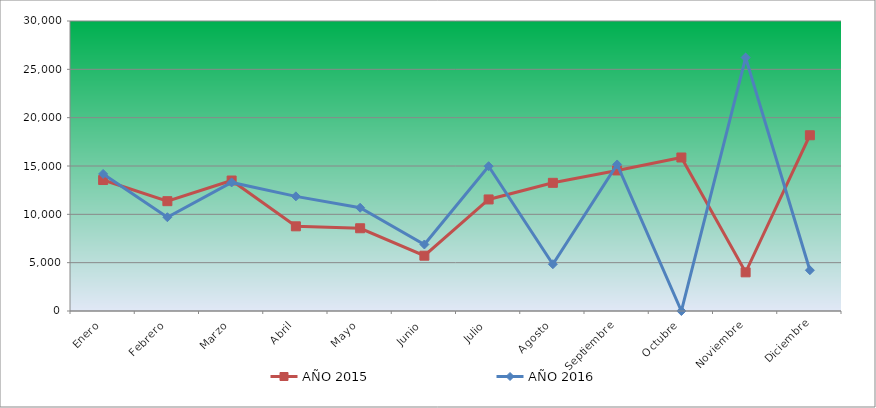
| Category | AÑO 2015 | AÑO 2016 |
|---|---|---|
| Enero | 13550 | 14180 |
| Febrero | 11360 | 9700 |
| Marzo | 13500 | 13300 |
| Abril | 8760 | 11860 |
| Mayo | 8560 | 10680 |
| Junio | 5720 | 6880 |
| Julio | 11540 | 14980 |
| Agosto | 13260 | 4840 |
| Septiembre | 14540 | 15160 |
| Octubre | 15880 | 0 |
| Noviembre | 4000 | 26220 |
| Diciembre | 18180 | 4220 |